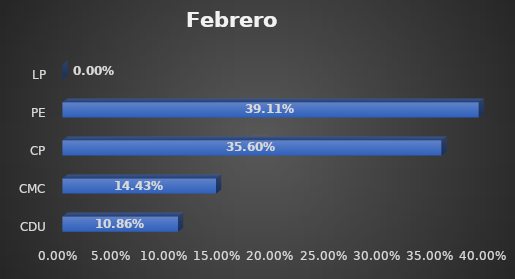
| Category | Series 0 |
|---|---|
| CDU | 0.109 |
| CMC | 0.144 |
| CP | 0.356 |
| PE | 0.391 |
| LP | 0 |